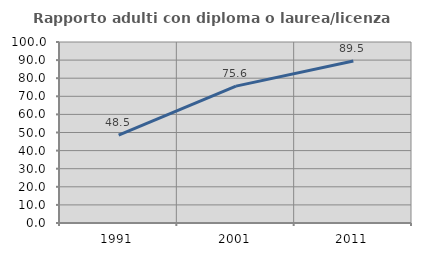
| Category | Rapporto adulti con diploma o laurea/licenza media  |
|---|---|
| 1991.0 | 48.512 |
| 2001.0 | 75.609 |
| 2011.0 | 89.534 |